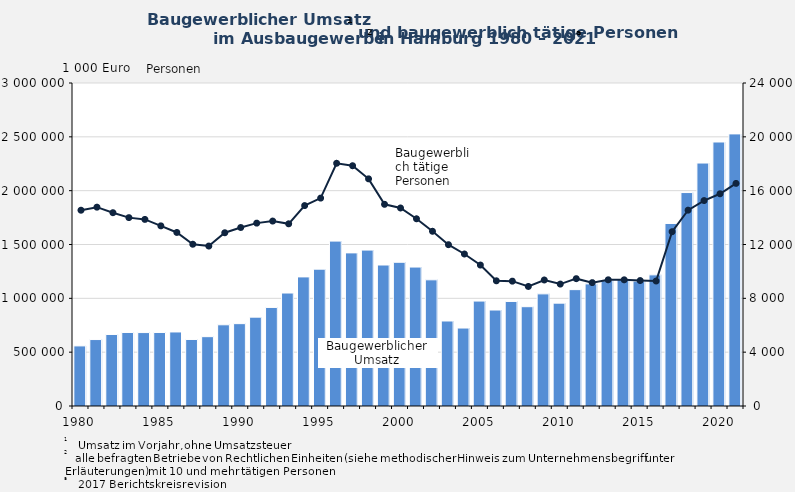
| Category | Baugewerblicher Umsatz in 1 000 Euro |
|---|---|
| 1980.0 | 558223 |
| 1981.0 | 617133 |
| 1982.0 | 664280 |
| 1983.0 | 682951 |
| 1984.0 | 682077 |
| 1985.0 | 682808 |
| 1986.0 | 687640 |
| 1987.0 | 617914 |
| 1988.0 | 644031 |
| 1989.0 | 754232 |
| 1990.0 | 764877 |
| 1991.0 | 825387 |
| 1992.0 | 915545 |
| 1993.0 | 1049292 |
| 1994.0 | 1199141 |
| 1995.0 | 1270896 |
| 1996.0 | 1531552 |
| 1997.0 | 1422133 |
| 1998.0 | 1448129 |
| 1999.0 | 1309526 |
| 2000.0 | 1334948 |
| 2001.0 | 1290538 |
| 2002.0 | 1171909 |
| 2003.0 | 789522 |
| 2004.0 | 724044 |
| 2005.0 | 974614 |
| 2006.0 | 891400 |
| 2007.0 | 970979 |
| 2008.0 | 922350 |
| 2009.0 | 1041413 |
| 2010.0 | 955419 |
| 2011.0 | 1080802 |
| 2012.0 | 1134409 |
| 2013.0 | 1164961 |
| 2014.0 | 1174909 |
| 2015.0 | 1160016 |
| 2016.0 | 1218133 |
| 2017.0 | 1695311 |
| 2018.0 | 1982401 |
| 2019.0 | 2256556 |
| 2020.0 | 2452082 |
| 2021.0 | 2527275 |